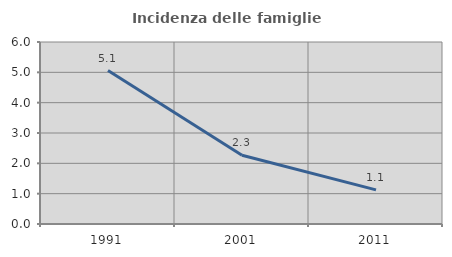
| Category | Incidenza delle famiglie numerose |
|---|---|
| 1991.0 | 5.058 |
| 2001.0 | 2.269 |
| 2011.0 | 1.125 |